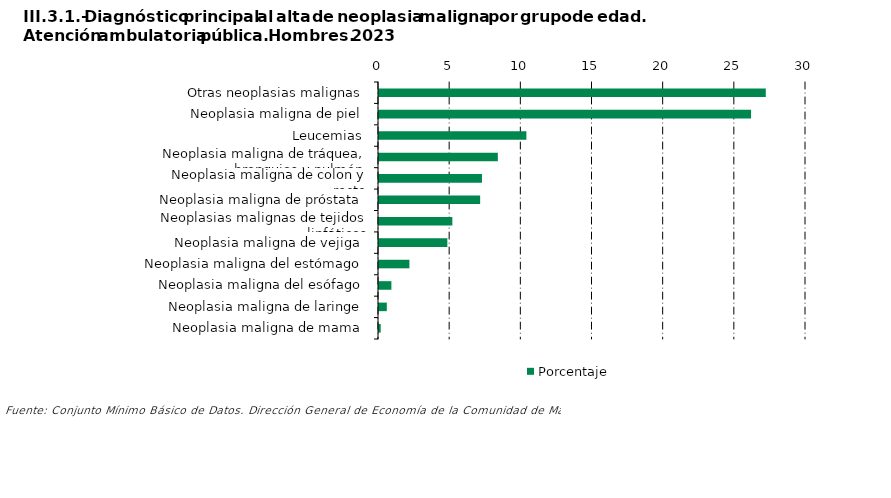
| Category | Porcentaje |
|---|---|
| Otras neoplasias malignas | 27.175 |
| Neoplasia maligna de piel | 26.139 |
| Leucemias | 10.355 |
| Neoplasia maligna de tráquea, bronquios y pulmón | 8.349 |
| Neoplasia maligna de colon y recto | 7.234 |
| Neoplasia maligna de próstata | 7.107 |
| Neoplasias malignas de tejidos linfáticos | 5.153 |
| Neoplasia maligna de vejiga | 4.802 |
| Neoplasia maligna del estómago | 2.137 |
| Neoplasia maligna del esófago | 0.871 |
| Neoplasia maligna de laringe | 0.549 |
| Neoplasia maligna de mama | 0.119 |